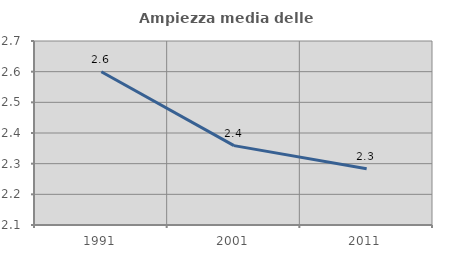
| Category | Ampiezza media delle famiglie |
|---|---|
| 1991.0 | 2.6 |
| 2001.0 | 2.359 |
| 2011.0 | 2.283 |